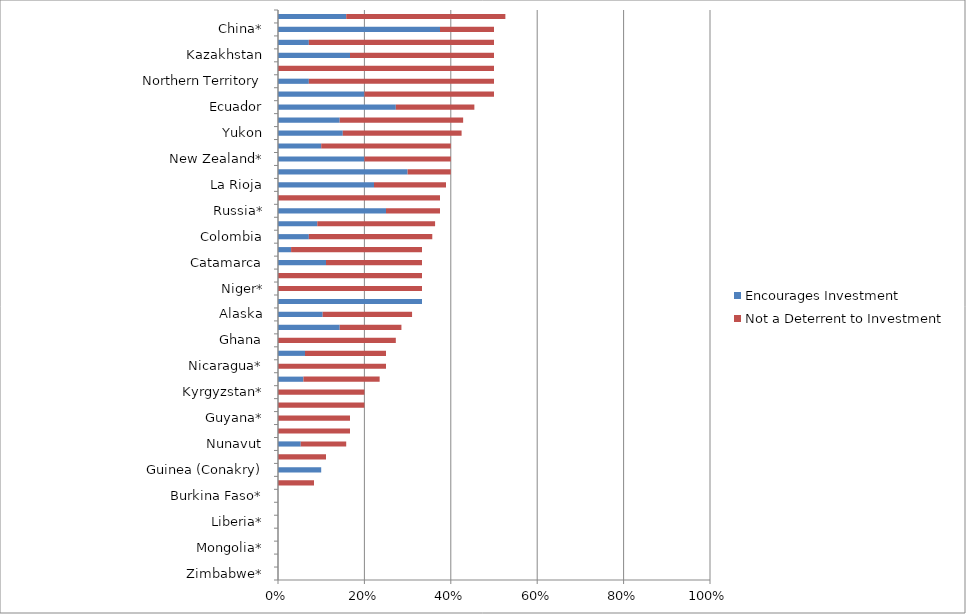
| Category | Encourages Investment | Not a Deterrent to Investment |
|---|---|---|
| Zimbabwe* | 0 | 0 |
| Papua New Guinea | 0 | 0 |
| Mongolia* | 0 | 0 |
| Mali* | 0 | 0 |
| Liberia* | 0 | 0 |
| Democratic Republic of Congo (DRC)* | 0 | 0 |
| Burkina Faso* | 0 | 0 |
| Indonesia | 0 | 0.083 |
| Guinea (Conakry) | 0.1 | 0 |
| Venezuela* | 0 | 0.111 |
| Nunavut | 0.053 | 0.105 |
| Panama* | 0 | 0.167 |
| Guyana* | 0 | 0.167 |
| Philippines* | 0 | 0.2 |
| Kyrgyzstan* | 0 | 0.2 |
| Northwest Territories | 0.059 | 0.176 |
| Nicaragua* | 0 | 0.25 |
| Bolivia | 0.062 | 0.188 |
| Ghana | 0 | 0.273 |
| Mauritania* | 0.143 | 0.143 |
| Alaska | 0.103 | 0.207 |
| Tanzania* | 0.333 | 0 |
| Niger* | 0 | 0.333 |
| Greenland* | 0 | 0.333 |
| Catamarca | 0.111 | 0.222 |
| Peru | 0.03 | 0.303 |
| Colombia | 0.071 | 0.286 |
| Brazil | 0.091 | 0.273 |
| Russia* | 0.25 | 0.125 |
| Botswana* | 0 | 0.375 |
| La Rioja | 0.222 | 0.167 |
| Rio Negro* | 0.3 | 0.1 |
| New Zealand* | 0.2 | 0.2 |
| Mendoza* | 0.1 | 0.3 |
| Yukon | 0.15 | 0.275 |
| Senegal* | 0.143 | 0.286 |
| Ecuador | 0.273 | 0.182 |
| South Africa | 0.2 | 0.3 |
| Northern Territory | 0.071 | 0.429 |
| Minnesota* | 0 | 0.5 |
| Kazakhstan | 0.167 | 0.333 |
| Chubut | 0.071 | 0.429 |
| China* | 0.375 | 0.125 |
| Jujuy | 0.158 | 0.368 |